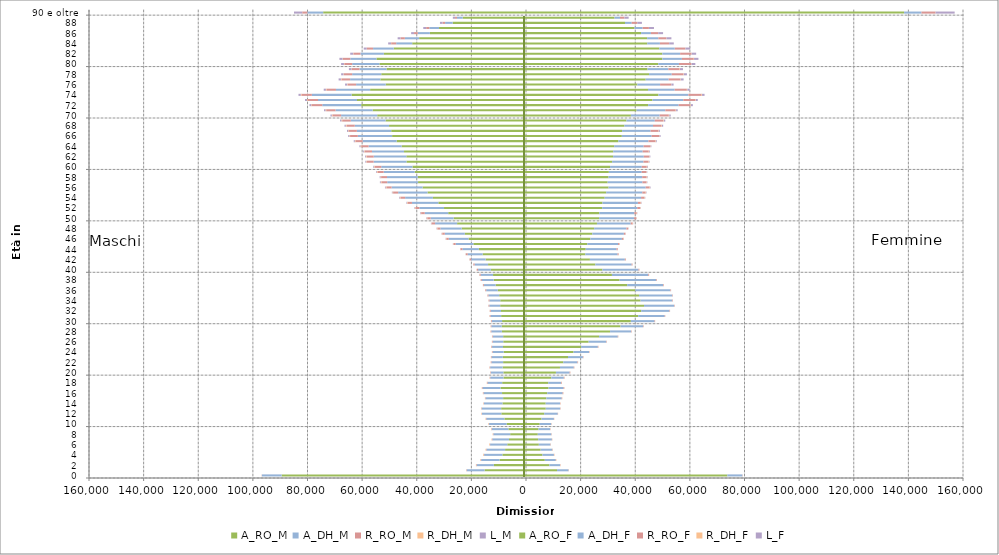
| Category | A_RO_M | A_DH_M | R_RO_M | R_DH_M | L_M | A_RO_F | A_DH_F | R_RO_F | R_DH_F | L_F |
|---|---|---|---|---|---|---|---|---|---|---|
| 0 | -89462 | -7242 | -53 | -41 | -1 | 73712 | 5547 | 65 | 39 | 0 |
| 1 | -15185 | -6529 | -119 | -82 | 0 | 11355 | 4222 | 80 | 47 | 0 |
| 2 | -11760 | -6297 | -162 | -126 | 0 | 8569 | 3921 | 88 | 95 | 0 |
| 3 | -9698 | -6716 | -164 | -190 | 0 | 6890 | 3998 | 107 | 118 | 0 |
| 4 | -8653 | -6673 | -144 | -215 | 0 | 6038 | 4176 | 86 | 121 | 0 |
| 5 | -7655 | -6811 | -146 | -196 | 0 | 5364 | 4276 | 96 | 114 | 0 |
| 6 | -6857 | -6284 | -133 | -210 | 0 | 4698 | 4269 | 79 | 96 | 0 |
| 7 | -6229 | -6101 | -128 | -174 | 0 | 4458 | 5016 | 81 | 106 | 0 |
| 8 | -5791 | -6164 | -96 | -161 | 0 | 4317 | 4966 | 85 | 72 | 0 |
| 9 | -6456 | -6094 | -117 | -153 | 0 | 4575 | 4275 | 69 | 67 | 0 |
| 10 | -7123 | -6404 | -100 | -167 | 0 | 5032 | 4233 | 58 | 82 | 0 |
| 11 | -7919 | -6627 | -118 | -141 | 0 | 5692 | 4519 | 83 | 60 | 1 |
| 12 | -9035 | -7077 | -105 | -146 | 0 | 6658 | 4966 | 80 | 62 | 0 |
| 13 | -9098 | -7126 | -123 | -141 | 0 | 7237 | 5271 | 115 | 58 | 0 |
| 14 | -8619 | -6778 | -131 | -118 | 0 | 7205 | 5253 | 139 | 88 | 0 |
| 15 | -8377 | -6444 | -130 | -102 | -1 | 7442 | 5605 | 168 | 94 | 1 |
| 16 | -8768 | -6792 | -138 | -103 | -4 | 7779 | 5634 | 196 | 90 | 2 |
| 17 | -9342 | -6576 | -180 | -101 | -1 | 8252 | 5506 | 240 | 87 | 2 |
| 18 | -8724 | -5374 | -177 | -83 | -5 | 8138 | 4692 | 237 | 78 | 13 |
| 19 | -8253 | -4841 | -173 | -65 | -6 | 9272 | 4573 | 226 | 81 | 13 |
| 20 | -8285 | -4597 | -166 | -61 | -10 | 10964 | 5005 | 223 | 64 | 14 |
| 21 | -8560 | -4559 | -191 | -73 | -12 | 12437 | 5054 | 177 | 63 | 11 |
| 22 | -8380 | -4280 | -209 | -66 | -12 | 13655 | 5176 | 182 | 65 | 9 |
| 23 | -8479 | -4130 | -174 | -66 | -10 | 15383 | 5451 | 144 | 61 | 16 |
| 24 | -8187 | -4057 | -167 | -68 | -13 | 17404 | 5677 | 134 | 51 | 6 |
| 25 | -8412 | -4012 | -232 | -68 | -16 | 20183 | 6113 | 166 | 52 | 8 |
| 26 | -8323 | -3886 | -205 | -61 | -21 | 22936 | 6437 | 159 | 42 | 6 |
| 27 | -8364 | -3781 | -221 | -77 | -20 | 26754 | 6845 | 149 | 49 | 12 |
| 28 | -8829 | -3882 | -222 | -72 | -19 | 30779 | 7710 | 166 | 63 | 16 |
| 29 | -8890 | -3788 | -207 | -76 | -17 | 34615 | 8242 | 177 | 41 | 16 |
| 30 | -8764 | -3770 | -233 | -55 | -17 | 38390 | 8697 | 142 | 48 | 11 |
| 31 | -9102 | -3894 | -276 | -80 | -23 | 41082 | 9684 | 179 | 47 | 15 |
| 32 | -9150 | -3800 | -252 | -78 | -26 | 42189 | 10334 | 169 | 37 | 18 |
| 33 | -9453 | -3966 | -274 | -64 | -27 | 43205 | 11030 | 167 | 50 | 13 |
| 34 | -9425 | -3956 | -287 | -66 | -22 | 41949 | 11628 | 178 | 46 | 14 |
| 35 | -9818 | -3941 | -305 | -67 | -36 | 41385 | 12192 | 172 | 43 | 15 |
| 36 | -10351 | -4217 | -330 | -77 | -28 | 40018 | 12842 | 187 | 68 | 16 |
| 37 | -11137 | -4223 | -323 | -74 | -31 | 37046 | 13134 | 208 | 67 | 18 |
| 38 | -11817 | -4364 | -376 | -57 | -39 | 34268 | 13384 | 221 | 54 | 24 |
| 39 | -12063 | -4532 | -384 | -90 | -43 | 31460 | 13302 | 246 | 61 | 22 |
| 40 | -12868 | -4683 | -423 | -107 | -43 | 27967 | 13229 | 265 | 72 | 35 |
| 41 | -13888 | -4906 | -456 | -92 | -53 | 25379 | 13296 | 270 | 66 | 35 |
| 42 | -14768 | -5285 | -533 | -108 | -67 | 23402 | 12785 | 336 | 68 | 27 |
| 43 | -15881 | -5462 | -621 | -115 | -68 | 21721 | 11787 | 366 | 77 | 55 |
| 44 | -17268 | -6028 | -661 | -117 | -83 | 21865 | 11289 | 403 | 86 | 45 |
| 45 | -19278 | -6481 | -785 | -136 | -97 | 22465 | 11244 | 447 | 98 | 57 |
| 46 | -21039 | -7256 | -884 | -152 | -91 | 23574 | 11550 | 525 | 123 | 50 |
| 47 | -22400 | -7335 | -930 | -171 | -112 | 24276 | 11552 | 542 | 92 | 65 |
| 48 | -23549 | -7807 | -1091 | -170 | -136 | 24947 | 11814 | 618 | 110 | 71 |
| 49 | -25226 | -8062 | -1169 | -177 | -178 | 25981 | 12345 | 720 | 133 | 85 |
| 50 | -26488 | -8425 | -1233 | -206 | -169 | 26758 | 12791 | 790 | 136 | 84 |
| 51 | -28473 | -8611 | -1309 | -187 | -186 | 26819 | 12820 | 869 | 142 | 95 |
| 52 | -30007 | -9044 | -1441 | -185 | -180 | 27882 | 12850 | 1000 | 166 | 105 |
| 53 | -32090 | -9666 | -1563 | -221 | -215 | 28016 | 12955 | 1028 | 175 | 124 |
| 54 | -34076 | -10179 | -1728 | -250 | -220 | 28806 | 13330 | 1218 | 163 | 154 |
| 55 | -36060 | -10748 | -1848 | -243 | -215 | 29358 | 13233 | 1209 | 161 | 166 |
| 56 | -37873 | -11345 | -1896 | -253 | -273 | 30225 | 13594 | 1445 | 162 | 181 |
| 57 | -39518 | -11295 | -2119 | -256 | -304 | 29890 | 12740 | 1481 | 158 | 171 |
| 58 | -39639 | -11249 | -2156 | -232 | -293 | 30227 | 12311 | 1638 | 190 | 182 |
| 59 | -40750 | -11360 | -2241 | -269 | -250 | 30337 | 12023 | 1661 | 171 | 213 |
| 60 | -41575 | -11432 | -2353 | -236 | -302 | 30775 | 11614 | 1819 | 178 | 247 |
| 61 | -43771 | -12016 | -2438 | -259 | -342 | 31519 | 11487 | 1828 | 160 | 239 |
| 62 | -43807 | -11961 | -2521 | -256 | -351 | 31887 | 11244 | 1955 | 167 | 278 |
| 63 | -44655 | -11728 | -2606 | -250 | -383 | 31913 | 10802 | 2214 | 171 | 276 |
| 64 | -45531 | -12112 | -2666 | -277 | -400 | 32273 | 10789 | 2350 | 195 | 292 |
| 65 | -47377 | -12433 | -2651 | -247 | -351 | 33804 | 11043 | 2517 | 184 | 302 |
| 66 | -49017 | -12559 | -2835 | -260 | -424 | 35089 | 10909 | 2698 | 196 | 379 |
| 67 | -49350 | -12581 | -2887 | -257 | -463 | 35177 | 10429 | 2803 | 194 | 394 |
| 68 | -50141 | -12564 | -2971 | -291 | -478 | 36027 | 10468 | 3112 | 180 | 434 |
| 69 | -51422 | -12722 | -3145 | -259 | -530 | 36776 | 10393 | 3123 | 193 | 504 |
| 70 | -54476 | -13228 | -3155 | -234 | -504 | 38403 | 10532 | 3347 | 179 | 520 |
| 71 | -56153 | -13591 | -3403 | -244 | -558 | 40487 | 10523 | 3776 | 177 | 578 |
| 72 | -60348 | -14247 | -3756 | -246 | -684 | 44711 | 11191 | 4250 | 201 | 741 |
| 73 | -61876 | -14280 | -3766 | -272 | -714 | 46316 | 11267 | 4392 | 203 | 716 |
| 74 | -63878 | -14536 | -3796 | -258 | -829 | 48493 | 10964 | 4802 | 202 | 912 |
| 75 | -57073 | -12507 | -3489 | -197 | -796 | 44664 | 9780 | 4451 | 176 | 867 |
| 76 | -51350 | -10858 | -3052 | -196 | -793 | 40755 | 8344 | 3986 | 140 | 817 |
| 77 | -53311 | -11091 | -3179 | -191 | -836 | 43820 | 8411 | 4296 | 130 | 1046 |
| 78 | -52992 | -10665 | -3003 | -160 | -860 | 45031 | 8314 | 4287 | 153 | 1131 |
| 79 | -51066 | -9883 | -2809 | -136 | -953 | 44499 | 7607 | 4132 | 144 | 1088 |
| 80 | -53677 | -9969 | -2870 | -149 | -1027 | 48433 | 7564 | 4471 | 131 | 1400 |
| 81 | -54756 | -9569 | -2717 | -132 | -1138 | 49922 | 7169 | 4342 | 100 | 1597 |
| 82 | -52036 | -8592 | -2560 | -103 | -1066 | 49912 | 6524 | 4158 | 77 | 1630 |
| 83 | -48410 | -7580 | -2235 | -78 | -1106 | 48812 | 5663 | 3811 | 75 | 1758 |
| 84 | -41667 | -5862 | -1833 | -59 | -1045 | 44382 | 4643 | 3324 | 60 | 1703 |
| 85 | -39124 | -5242 | -1533 | -46 | -1053 | 44349 | 4100 | 2939 | 54 | 1793 |
| 86 | -35190 | -4439 | -1358 | -32 | -1030 | 42138 | 3601 | 2628 | 38 | 1781 |
| 87 | -31840 | -3561 | -1140 | -22 | -1050 | 39704 | 2999 | 2292 | 29 | 1825 |
| 88 | -26849 | -2768 | -939 | -16 | -932 | 36243 | 2453 | 2030 | 24 | 1686 |
| 89 | -23156 | -2121 | -696 | -9 | -808 | 32411 | 2012 | 1633 | 12 | 1513 |
| 90 e oltre | -74265 | -5789 | -1876 | -16 | -2997 | 138426 | 6372 | 5151 | 27 | 6971 |